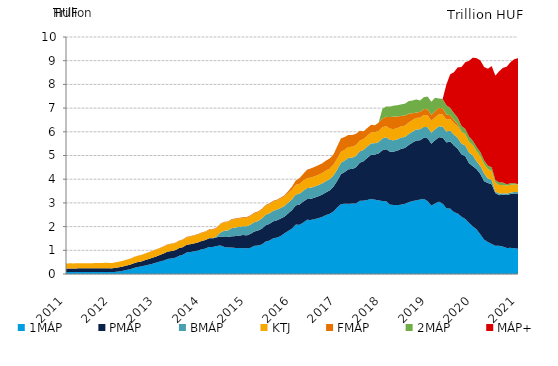
| Category | 1MÁP | PMÁP | BMÁP | KTJ | FMÁP | 2MÁP | MÁP+ |
|---|---|---|---|---|---|---|---|
| 1/31/11 | 0.085 | 0.141 | 0 | 0.218 | 0 | 0 | 0 |
| 2/28/11 | 0.085 | 0.147 | 0 | 0.218 | 0 | 0 | 0 |
| 3/31/11 | 0.081 | 0.149 | 0 | 0.217 | 0 | 0 | 0 |
| 4/30/11 | 0.082 | 0.156 | 0 | 0.216 | 0 | 0 | 0 |
| 5/31/11 | 0.083 | 0.158 | 0 | 0.215 | 0 | 0 | 0 |
| 6/30/11 | 0.083 | 0.159 | 0 | 0.214 | 0 | 0 | 0 |
| 7/31/11 | 0.082 | 0.16 | 0 | 0.214 | 0 | 0 | 0 |
| 8/31/11 | 0.081 | 0.161 | 0 | 0.215 | 0 | 0 | 0 |
| 9/30/11 | 0.08 | 0.164 | 0 | 0.217 | 0 | 0 | 0 |
| 10/31/11 | 0.079 | 0.166 | 0 | 0.219 | 0 | 0 | 0 |
| 11/30/11 | 0.08 | 0.166 | 0 | 0.223 | 0 | 0 | 0 |
| 12/31/11 | 0.08 | 0.166 | 0 | 0.226 | 0 | 0 | 0 |
| 1/31/12 | 0.081 | 0.155 | 0 | 0.225 | 0 | 0 | 0 |
| 2/29/12 | 0.089 | 0.168 | 0 | 0.23 | 0 | 0 | 0 |
| 3/31/12 | 0.106 | 0.176 | 0 | 0.236 | 0 | 0 | 0 |
| 4/30/12 | 0.131 | 0.182 | 0 | 0.24 | 0 | 0 | 0 |
| 5/31/12 | 0.17 | 0.186 | 0 | 0.245 | 0.003 | 0 | 0 |
| 6/30/12 | 0.198 | 0.194 | 0 | 0.25 | 0.004 | 0 | 0 |
| 7/31/12 | 0.254 | 0.2 | 0 | 0.257 | 0.006 | 0 | 0 |
| 8/31/12 | 0.294 | 0.206 | 0 | 0.263 | 0.008 | 0 | 0 |
| 9/30/12 | 0.32 | 0.211 | 0 | 0.268 | 0.008 | 0 | 0 |
| 10/31/12 | 0.358 | 0.227 | 0 | 0.273 | 0.01 | 0 | 0 |
| 11/30/12 | 0.395 | 0.242 | 0 | 0.279 | 0.009 | 0 | 0 |
| 12/31/12 | 0.434 | 0.256 | 0 | 0.284 | 0.01 | 0 | 0 |
| 1/31/13 | 0.482 | 0.26 | 0 | 0.289 | 0.011 | 0 | 0 |
| 2/28/13 | 0.528 | 0.279 | 0 | 0.291 | 0.012 | 0 | 0 |
| 3/31/13 | 0.57 | 0.3 | 0 | 0.294 | 0.013 | 0 | 0 |
| 4/30/13 | 0.636 | 0.31 | 0 | 0.297 | 0.014 | 0 | 0 |
| 5/31/13 | 0.655 | 0.314 | 0 | 0.3 | 0.014 | 0 | 0 |
| 6/30/13 | 0.687 | 0.317 | 0 | 0.302 | 0.014 | 0 | 0 |
| 7/31/13 | 0.766 | 0.324 | 0 | 0.306 | 0.015 | 0 | 0 |
| 8/31/13 | 0.813 | 0.317 | 0 | 0.313 | 0.016 | 0 | 0 |
| 9/30/13 | 0.907 | 0.324 | 0 | 0.317 | 0.019 | 0 | 0 |
| 10/31/13 | 0.927 | 0.33 | 0 | 0.321 | 0.019 | 0 | 0 |
| 11/30/13 | 0.955 | 0.336 | 0 | 0.328 | 0.021 | 0 | 0 |
| 12/31/13 | 0.988 | 0.343 | 0 | 0.335 | 0.021 | 0 | 0 |
| 1/31/14 | 1.039 | 0.354 | 0 | 0.337 | 0.022 | 0 | 0 |
| 2/28/14 | 1.073 | 0.359 | 0 | 0.34 | 0.023 | 0 | 0 |
| 3/31/14 | 1.143 | 0.363 | 0.008 | 0.345 | 0.025 | 0 | 0 |
| 4/30/14 | 1.14 | 0.364 | 0.02 | 0.346 | 0.026 | 0 | 0 |
| 5/31/14 | 1.182 | 0.367 | 0.041 | 0.347 | 0.027 | 0 | 0 |
| 6/30/14 | 1.206 | 0.379 | 0.165 | 0.347 | 0.028 | 0 | 0 |
| 7/31/14 | 1.142 | 0.419 | 0.27 | 0.347 | 0.027 | 0 | 0 |
| 8/31/14 | 1.119 | 0.446 | 0.275 | 0.348 | 0.027 | 0 | 0 |
| 9/30/14 | 1.116 | 0.475 | 0.347 | 0.349 | 0.029 | 0 | 0 |
| 10/31/14 | 1.101 | 0.499 | 0.365 | 0.352 | 0.029 | 0 | 0 |
| 11/30/14 | 1.096 | 0.524 | 0.368 | 0.353 | 0.029 | 0 | 0 |
| 12/31/14 | 1.089 | 0.556 | 0.372 | 0.355 | 0.029 | 0 | 0 |
| 1/31/15 | 1.084 | 0.545 | 0.387 | 0.358 | 0.033 | 0 | 0 |
| 2/28/15 | 1.105 | 0.589 | 0.391 | 0.359 | 0.034 | 0 | 0 |
| 3/31/15 | 1.189 | 0.603 | 0.394 | 0.368 | 0.035 | 0 | 0 |
| 4/30/15 | 1.204 | 0.635 | 0.397 | 0.37 | 0.034 | 0 | 0 |
| 5/31/15 | 1.246 | 0.665 | 0.435 | 0.372 | 0.034 | 0 | 0 |
| 6/30/15 | 1.371 | 0.686 | 0.444 | 0.376 | 0.035 | 0 | 0 |
| 7/31/15 | 1.41 | 0.706 | 0.446 | 0.382 | 0.033 | 0 | 0 |
| 8/31/15 | 1.503 | 0.718 | 0.447 | 0.387 | 0.036 | 0 | 0 |
| 9/30/15 | 1.537 | 0.728 | 0.448 | 0.389 | 0.035 | 0 | 0 |
| 10/31/15 | 1.601 | 0.739 | 0.449 | 0.394 | 0.037 | 0 | 0 |
| 11/30/15 | 1.719 | 0.701 | 0.451 | 0.398 | 0.052 | 0 | 0 |
| 12/31/15 | 1.816 | 0.744 | 0.454 | 0.403 | 0.081 | 0 | 0 |
| 1/31/16 | 1.914 | 0.782 | 0.455 | 0.409 | 0.127 | 0 | 0 |
| 2/29/16 | 2.088 | 0.809 | 0.456 | 0.415 | 0.18 | 0 | 0 |
| 3/31/16 | 2.076 | 0.852 | 0.46 | 0.415 | 0.243 | 0 | 0 |
| 4/30/16 | 2.17 | 0.885 | 0.461 | 0.419 | 0.293 | 0 | 0 |
| 5/31/16 | 2.287 | 0.874 | 0.465 | 0.423 | 0.353 | 0 | 0 |
| 6/30/16 | 2.281 | 0.892 | 0.467 | 0.426 | 0.388 | 0 | 0 |
| 7/31/16 | 2.315 | 0.907 | 0.47 | 0.43 | 0.395 | 0 | 0 |
| 8/31/16 | 2.355 | 0.924 | 0.472 | 0.433 | 0.407 | 0 | 0 |
| 9/30/16 | 2.407 | 0.941 | 0.475 | 0.437 | 0.406 | 0 | 0 |
| 10/31/16 | 2.484 | 0.959 | 0.476 | 0.439 | 0.424 | 0 | 0 |
| 11/30/16 | 2.541 | 0.985 | 0.477 | 0.444 | 0.429 | 0 | 0 |
| 12/31/16 | 2.637 | 1.043 | 0.478 | 0.454 | 0.429 | 0 | 0 |
| 1/31/17 | 2.806 | 1.125 | 0.479 | 0.46 | 0.516 | 0 | 0 |
| 2/28/17 | 2.947 | 1.268 | 0.48 | 0.46 | 0.568 | 0 | 0 |
| 3/31/17 | 2.967 | 1.337 | 0.481 | 0.46 | 0.535 | 0 | 0 |
| 4/30/17 | 2.961 | 1.462 | 0.481 | 0.459 | 0.508 | 0 | 0 |
| 5/31/17 | 2.974 | 1.454 | 0.481 | 0.456 | 0.503 | 0 | 0 |
| 6/30/17 | 2.977 | 1.528 | 0.481 | 0.456 | 0.475 | 0 | 0 |
| 7/31/17 | 3.088 | 1.608 | 0.48 | 0.457 | 0.409 | 0 | 0 |
| 8/31/17 | 3.097 | 1.661 | 0.48 | 0.457 | 0.327 | 0 | 0 |
| 9/30/17 | 3.123 | 1.782 | 0.48 | 0.459 | 0.319 | 0 | 0 |
| 10/31/17 | 3.171 | 1.858 | 0.48 | 0.462 | 0.325 | 0 | 0 |
| 11/30/17 | 3.136 | 1.904 | 0.481 | 0.463 | 0.291 | 0 | 0 |
| 12/31/17 | 3.11 | 1.976 | 0.481 | 0.469 | 0.352 | 0 | 0 |
| 1/31/18 | 3.078 | 2.141 | 0.502 | 0.471 | 0.365 | 0.412 | 0 |
| 2/28/18 | 3.071 | 2.197 | 0.501 | 0.471 | 0.393 | 0.436 | 0 |
| 3/31/18 | 2.925 | 2.233 | 0.501 | 0.472 | 0.488 | 0.446 | 0 |
| 4/30/18 | 2.913 | 2.251 | 0.478 | 0.473 | 0.528 | 0.46 | 0 |
| 5/31/18 | 2.904 | 2.303 | 0.479 | 0.472 | 0.488 | 0.475 | 0 |
| 6/30/18 | 2.927 | 2.355 | 0.479 | 0.474 | 0.439 | 0.485 | 0 |
| 7/31/18 | 2.964 | 2.354 | 0.465 | 0.476 | 0.424 | 0.503 | 0 |
| 8/31/18 | 3.03 | 2.416 | 0.465 | 0.482 | 0.378 | 0.526 | 0 |
| 9/30/18 | 3.078 | 2.468 | 0.465 | 0.485 | 0.286 | 0.538 | 0 |
| 10/31/18 | 3.109 | 2.525 | 0.465 | 0.488 | 0.228 | 0.554 | 0 |
| 11/30/18 | 3.141 | 2.5 | 0.465 | 0.493 | 0.237 | 0.484 | 0 |
| 12/31/18 | 3.17 | 2.576 | 0.465 | 0.496 | 0.254 | 0.5 | 0 |
| 1/31/19 | 3.075 | 2.654 | 0.465 | 0.5 | 0.257 | 0.536 | 0 |
| 2/28/19 | 2.887 | 2.61 | 0.464 | 0.502 | 0.25 | 0.557 | 0 |
| 3/31/19 | 2.979 | 2.668 | 0.464 | 0.504 | 0.255 | 0.565 | 0 |
| 4/30/19 | 3.051 | 2.718 | 0.464 | 0.506 | 0.276 | 0.392 | 0 |
| 5/31/19 | 2.966 | 2.79 | 0.464 | 0.507 | 0.263 | 0.398 | 0 |
| 6/30/19 | 2.774 | 2.778 | 0.461 | 0.498 | 0.213 | 0.394 | 0.883 |
| 7/31/19 | 2.759 | 2.831 | 0.46 | 0.49 | 0.167 | 0.303 | 1.417 |
| 8/31/19 | 2.61 | 2.81 | 0.459 | 0.486 | 0.131 | 0.293 | 1.725 |
| 9/30/19 | 2.551 | 2.733 | 0.458 | 0.489 | 0.088 | 0.279 | 2.124 |
| 10/31/19 | 2.418 | 2.631 | 0.453 | 0.487 | 0.03 | 0.228 | 2.485 |
| 11/30/19 | 2.322 | 2.648 | 0.452 | 0.473 | 0 | 0.225 | 2.815 |
| 12/31/19 | 2.158 | 2.518 | 0.451 | 0.455 | 0 | 0.215 | 3.196 |
| 1/31/20 | 2.009 | 2.542 | 0.451 | 0.439 | 0 | 0.183 | 3.504 |
| 2/29/20 | 1.884 | 2.541 | 0.331 | 0.426 | 0 | 0.182 | 3.744 |
| 3/31/20 | 1.673 | 2.552 | 0.331 | 0.409 | 0 | 0.18 | 3.872 |
| 4/30/20 | 1.448 | 2.466 | 0.33 | 0.399 | 0 | 0.151 | 3.939 |
| 5/31/20 | 1.35 | 2.491 | 0.189 | 0.393 | 0 | 0.151 | 4.09 |
| 6/30/20 | 1.268 | 2.513 | 0.189 | 0.383 | 0 | 0.15 | 4.268 |
| 7/31/20 | 1.189 | 2.221 | 0.07 | 0.374 | 0 | 0.108 | 4.409 |
| 8/31/20 | 1.189 | 2.138 | 0.07 | 0.361 | 0 | 0.107 | 4.689 |
| 9/30/20 | 1.158 | 2.185 | 0.062 | 0.347 | 0 | 0.107 | 4.839 |
| 10/31/20 | 1.1 | 2.231 | 0.062 | 0.336 | 0 | 0.06 | 4.958 |
| 11/30/20 | 1.103 | 2.272 | 0.062 | 0.328 | 0 | 0.06 | 5.11 |
| 12/31/20 | 1.088 | 2.31 | 0.061 | 0.321 | 0 | 0.059 | 5.221 |
| 1/31/21 | 1.064 | 2.332 | 0.061 | 0.315 | 0 | 0.013 | 5.322 |